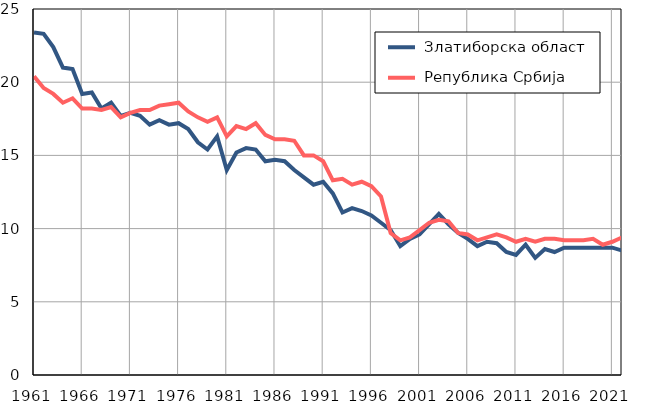
| Category |  Златиборска област |  Република Србија |
|---|---|---|
| 1961.0 | 23.4 | 20.4 |
| 1962.0 | 23.3 | 19.6 |
| 1963.0 | 22.4 | 19.2 |
| 1964.0 | 21 | 18.6 |
| 1965.0 | 20.9 | 18.9 |
| 1966.0 | 19.2 | 18.2 |
| 1967.0 | 19.3 | 18.2 |
| 1968.0 | 18.2 | 18.1 |
| 1969.0 | 18.6 | 18.3 |
| 1970.0 | 17.7 | 17.6 |
| 1971.0 | 17.9 | 17.9 |
| 1972.0 | 17.7 | 18.1 |
| 1973.0 | 17.1 | 18.1 |
| 1974.0 | 17.4 | 18.4 |
| 1975.0 | 17.1 | 18.5 |
| 1976.0 | 17.2 | 18.6 |
| 1977.0 | 16.8 | 18 |
| 1978.0 | 15.9 | 17.6 |
| 1979.0 | 15.4 | 17.3 |
| 1980.0 | 16.3 | 17.6 |
| 1981.0 | 14 | 16.3 |
| 1982.0 | 15.2 | 17 |
| 1983.0 | 15.5 | 16.8 |
| 1984.0 | 15.4 | 17.2 |
| 1985.0 | 14.6 | 16.4 |
| 1986.0 | 14.7 | 16.1 |
| 1987.0 | 14.6 | 16.1 |
| 1988.0 | 14 | 16 |
| 1989.0 | 13.5 | 15 |
| 1990.0 | 13 | 15 |
| 1991.0 | 13.2 | 14.6 |
| 1992.0 | 12.4 | 13.3 |
| 1993.0 | 11.1 | 13.4 |
| 1994.0 | 11.4 | 13 |
| 1995.0 | 11.2 | 13.2 |
| 1996.0 | 10.9 | 12.9 |
| 1997.0 | 10.4 | 12.2 |
| 1998.0 | 9.9 | 9.7 |
| 1999.0 | 8.8 | 9.2 |
| 2000.0 | 9.3 | 9.4 |
| 2001.0 | 9.6 | 9.9 |
| 2002.0 | 10.3 | 10.4 |
| 2003.0 | 11 | 10.6 |
| 2004.0 | 10.3 | 10.5 |
| 2005.0 | 9.7 | 9.7 |
| 2006.0 | 9.3 | 9.6 |
| 2007.0 | 8.8 | 9.2 |
| 2008.0 | 9.1 | 9.4 |
| 2009.0 | 9 | 9.6 |
| 2010.0 | 8.4 | 9.4 |
| 2011.0 | 8.2 | 9.1 |
| 2012.0 | 8.9 | 9.3 |
| 2013.0 | 8 | 9.1 |
| 2014.0 | 8.6 | 9.3 |
| 2015.0 | 8.4 | 9.3 |
| 2016.0 | 8.7 | 9.2 |
| 2017.0 | 8.7 | 9.2 |
| 2018.0 | 8.7 | 9.2 |
| 2019.0 | 8.7 | 9.3 |
| 2020.0 | 8.7 | 8.9 |
| 2021.0 | 8.7 | 9.1 |
| 2022.0 | 8.5 | 9.4 |